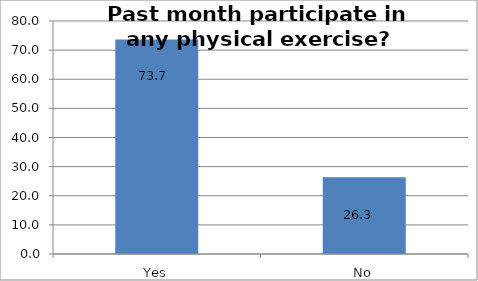
| Category | Series 0 |
|---|---|
| Yes | 73.685 |
| No | 26.315 |